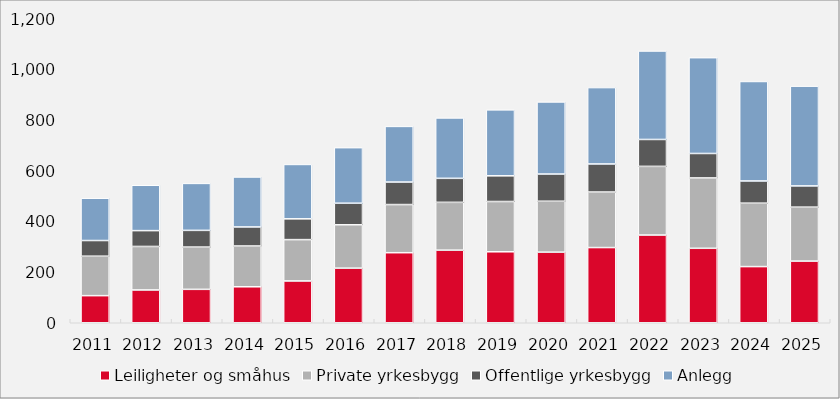
| Category | Leiligheter og småhus | Private yrkesbygg | Offentlige yrkesbygg | Anlegg |
|---|---|---|---|---|
| 2011.0 | 106.96 | 155.776 | 61.865 | 167.016 |
| 2012.0 | 129.497 | 171.617 | 62.564 | 178.965 |
| 2013.0 | 131.883 | 166.854 | 65.943 | 185.394 |
| 2014.0 | 142.024 | 160.958 | 75.2 | 197.228 |
| 2015.0 | 164.995 | 163.187 | 82.062 | 214.658 |
| 2016.0 | 215.558 | 171.102 | 85.187 | 219.346 |
| 2017.0 | 276.549 | 189.987 | 88.9 | 219.632 |
| 2018.0 | 286.601 | 188.695 | 94.845 | 238.343 |
| 2019.0 | 280.173 | 198.445 | 101.457 | 260.267 |
| 2020.0 | 278.68 | 201.042 | 107.33 | 284.532 |
| 2021.0 | 296.801 | 219.225 | 110.757 | 301.584 |
| 2022.0 | 346.294 | 270.997 | 106.217 | 349.225 |
| 2023.0 | 293.912 | 277.745 | 96.51 | 378.254 |
| 2024.0 | 221.701 | 250.363 | 87.619 | 392.695 |
| 2025.0 | 243.441 | 212.968 | 83.721 | 393.874 |